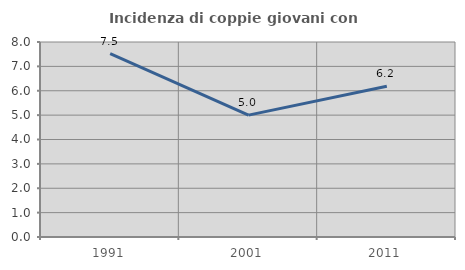
| Category | Incidenza di coppie giovani con figli |
|---|---|
| 1991.0 | 7.519 |
| 2001.0 | 5 |
| 2011.0 | 6.186 |